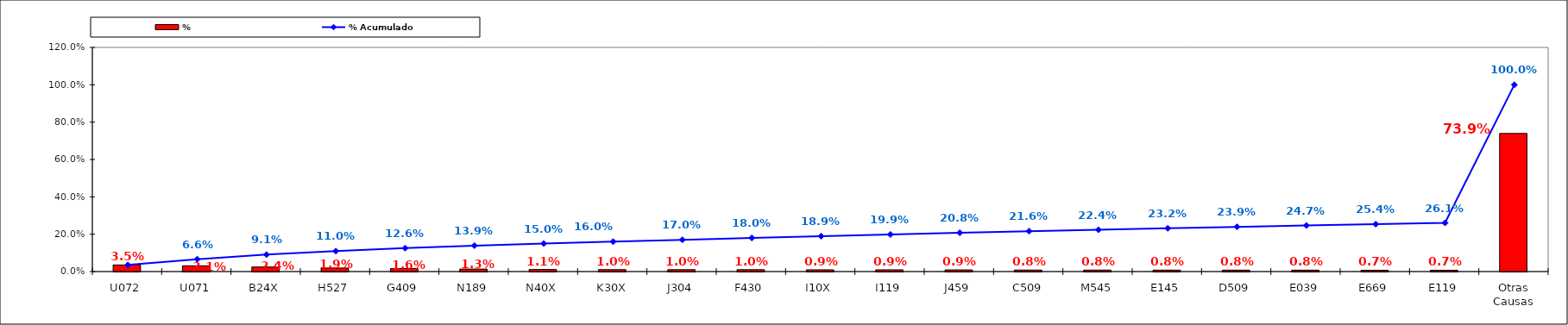
| Category | % |
|---|---|
| U072 | 0.035 |
| U071 | 0.031 |
| B24X | 0.024 |
| H527 | 0.019 |
| G409 | 0.016 |
| N189 | 0.013 |
| N40X | 0.011 |
| K30X | 0.01 |
| J304 | 0.01 |
| F430 | 0.01 |
| I10X | 0.009 |
| I119 | 0.009 |
| J459 | 0.009 |
| C509 | 0.008 |
| M545 | 0.008 |
| E145 | 0.008 |
| D509 | 0.008 |
| E039 | 0.008 |
| E669 | 0.007 |
| E119 | 0.007 |
| Otras Causas | 0.739 |